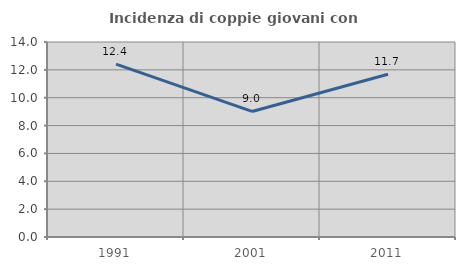
| Category | Incidenza di coppie giovani con figli |
|---|---|
| 1991.0 | 12.415 |
| 2001.0 | 9.015 |
| 2011.0 | 11.683 |